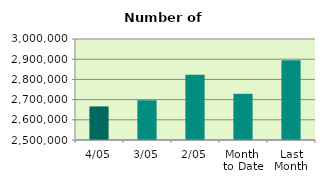
| Category | Series 0 |
|---|---|
| 4/05 | 2666226 |
| 3/05 | 2696630 |
| 2/05 | 2823218 |
| Month 
to Date | 2728691.333 |
| Last
Month | 2895009.158 |